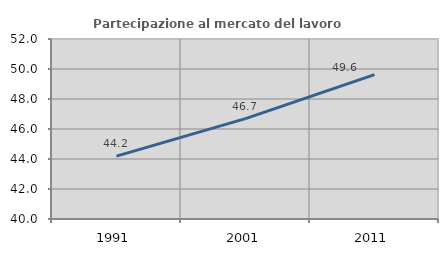
| Category | Partecipazione al mercato del lavoro  femminile |
|---|---|
| 1991.0 | 44.195 |
| 2001.0 | 46.695 |
| 2011.0 | 49.624 |